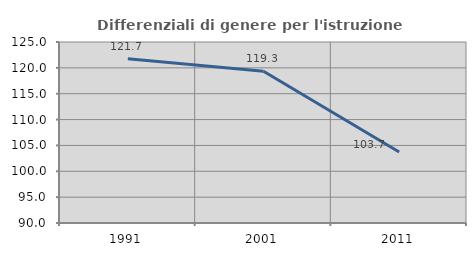
| Category | Differenziali di genere per l'istruzione superiore |
|---|---|
| 1991.0 | 121.748 |
| 2001.0 | 119.335 |
| 2011.0 | 103.73 |